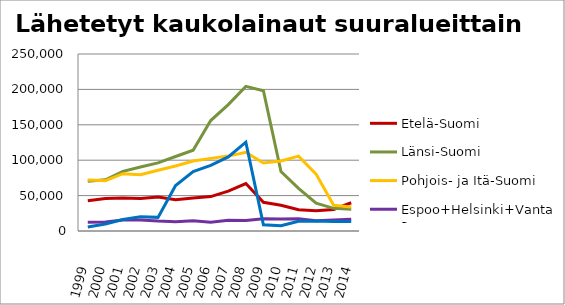
| Category | Etelä-Suomi | Länsi-Suomi | Pohjois- ja Itä-Suomi | Espoo+Helsinki+Vantaa | Muu Uusimaa |
|---|---|---|---|---|---|
| 1999.0 | 42648 | 70187 | 72113 | 12245 | 5576 |
| 2000.0 | 45990 | 72344 | 71024 | 12707 | 10017 |
| 2001.0 | 46443 | 84169 | 80928 | 15594 | 16125 |
| 2002.0 | 45875 | 90386 | 79606 | 15657 | 20009 |
| 2003.0 | 47965 | 96250 | 85829 | 14095 | 19252 |
| 2004.0 | 44039 | 105216 | 91837 | 13163 | 64311 |
| 2005.0 | 46655 | 114141 | 98831 | 14315 | 84054 |
| 2006.0 | 48645 | 156002 | 102584 | 12304 | 92602 |
| 2007.0 | 56407 | 178473 | 105796 | 15090 | 104684 |
| 2008.0 | 67063 | 204293 | 111189 | 14674 | 125448 |
| 2009.0 | 40461 | 198181 | 96092 | 17371 | 8725 |
| 2010.0 | 36377 | 83936 | 98872 | 16842 | 7432 |
| 2011.0 | 30131 | 60309 | 105718 | 17327 | 13769 |
| 2012.0 | 28752 | 39325 | 80316 | 14370 | 13976 |
| 2013.0 | 30363 | 32010 | 36343 | 15398 | 13435 |
| 2014.0 | 39912 | 30728 | 33915 | 16536 | 13579 |